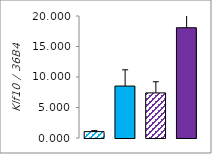
| Category | Series 0 |
|---|---|
| 0 | 1.042 |
| 1 | 8.517 |
| 2 | 7.394 |
| 3 | 18.075 |